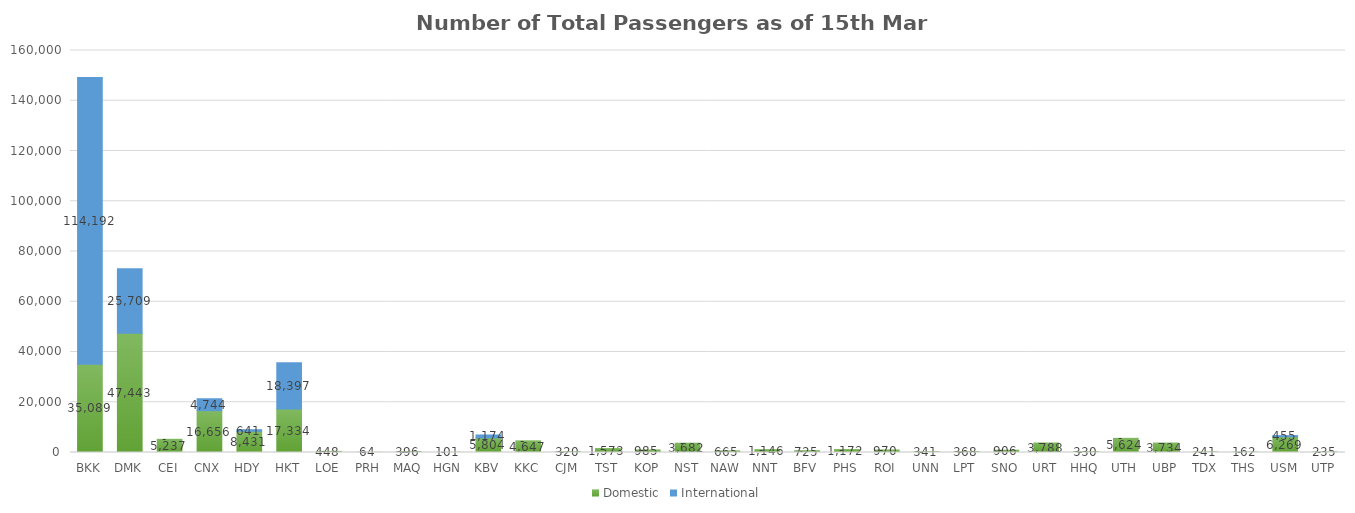
| Category | Domestic | International |
|---|---|---|
| BKK | 35089 | 114192 |
| DMK | 47443 | 25709 |
| CEI | 5237 | 0 |
| CNX | 16656 | 4744 |
| HDY | 8431 | 641 |
| HKT | 17334 | 18397 |
| LOE | 448 | 0 |
| PRH | 64 | 0 |
| MAQ | 396 | 0 |
| HGN | 101 | 0 |
| KBV | 5804 | 1174 |
| KKC | 4647 | 0 |
| CJM | 320 | 0 |
| TST | 1573 | 0 |
| KOP | 985 | 0 |
| NST | 3682 | 0 |
| NAW | 665 | 0 |
| NNT | 1146 | 0 |
| BFV | 725 | 0 |
| PHS | 1172 | 0 |
| ROI | 970 | 0 |
| UNN | 341 | 0 |
| LPT | 368 | 0 |
| SNO | 906 | 0 |
| URT | 3788 | 0 |
| HHQ | 330 | 0 |
| UTH | 5624 | 0 |
| UBP | 3734 | 0 |
| TDX | 241 | 0 |
| THS | 162 | 0 |
| USM | 6269 | 455 |
| UTP | 235 | 0 |